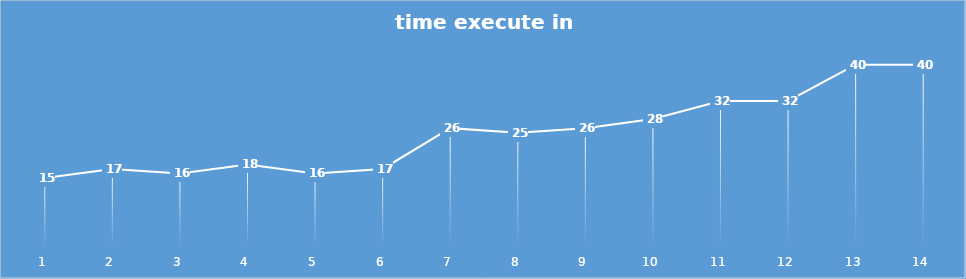
| Category | time execute in console(ms) |
|---|---|
| 0 | 15 |
| 1 | 17 |
| 2 | 16 |
| 3 | 18 |
| 4 | 16 |
| 5 | 17 |
| 6 | 26 |
| 7 | 25 |
| 8 | 26 |
| 9 | 28 |
| 10 | 32 |
| 11 | 32 |
| 12 | 40 |
| 13 | 40 |